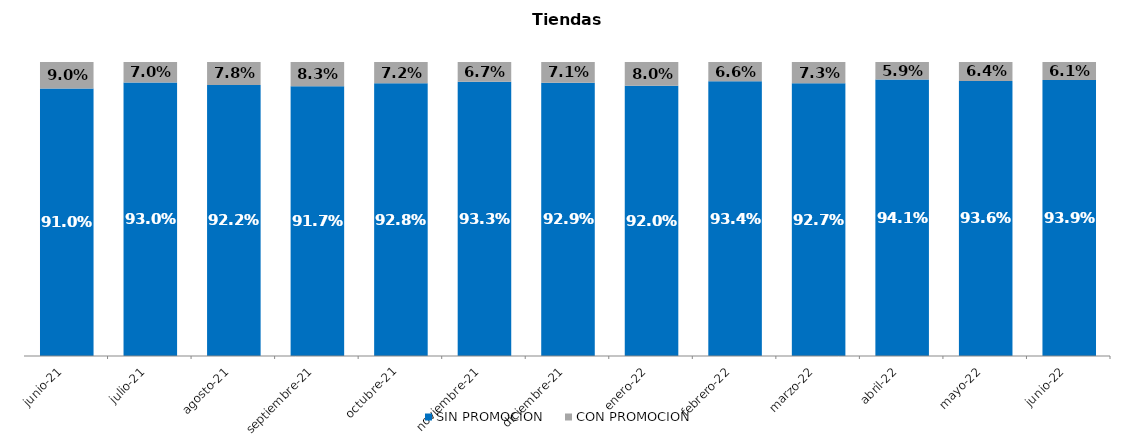
| Category | SIN PROMOCION   | CON PROMOCION   |
|---|---|---|
| 2021-06-01 | 0.91 | 0.09 |
| 2021-07-01 | 0.93 | 0.07 |
| 2021-08-01 | 0.922 | 0.078 |
| 2021-09-01 | 0.917 | 0.083 |
| 2021-10-01 | 0.928 | 0.072 |
| 2021-11-01 | 0.933 | 0.067 |
| 2021-12-01 | 0.929 | 0.071 |
| 2022-01-01 | 0.92 | 0.08 |
| 2022-02-01 | 0.934 | 0.066 |
| 2022-03-01 | 0.927 | 0.073 |
| 2022-04-01 | 0.941 | 0.059 |
| 2022-05-01 | 0.936 | 0.064 |
| 2022-06-01 | 0.939 | 0.061 |